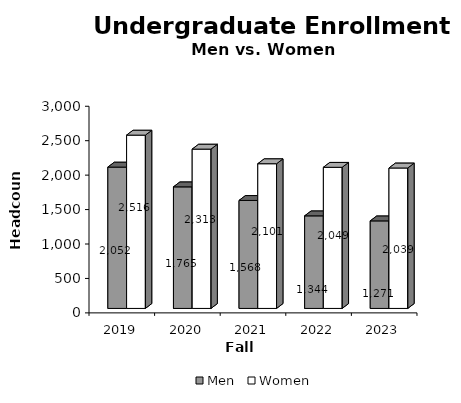
| Category | Men | Women |
|---|---|---|
| 2019.0 | 2052 | 2516 |
| 2020.0 | 1765 | 2313 |
| 2021.0 | 1568 | 2101 |
| 2022.0 | 1344 | 2049 |
| 2023.0 | 1271 | 2039 |